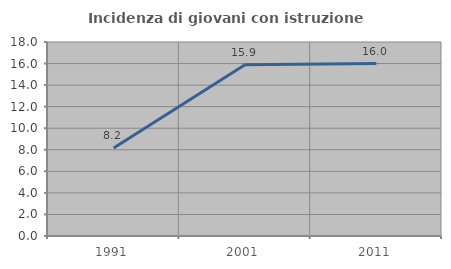
| Category | Incidenza di giovani con istruzione universitaria |
|---|---|
| 1991.0 | 8.163 |
| 2001.0 | 15.882 |
| 2011.0 | 16 |